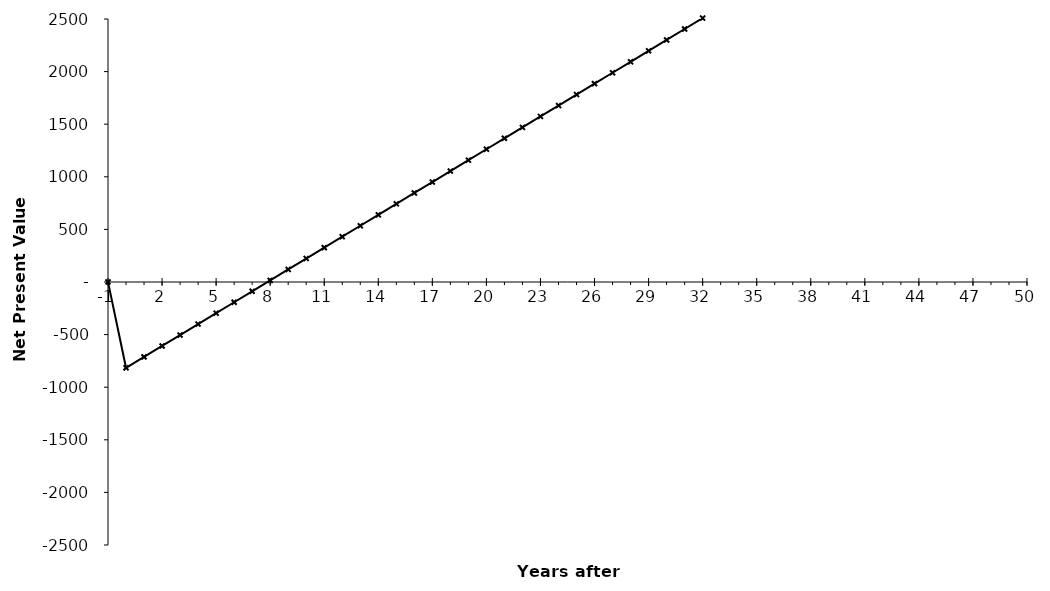
| Category | Net Present Value |
|---|---|
| -1.0 | 0 |
| 0.0 | -815821465.334 |
| 1.0 | -711931258.689 |
| 2.0 | -608041052.045 |
| 3.0 | -504150845.401 |
| 4.0 | -400260638.757 |
| 5.0 | -296370432.113 |
| 6.0 | -192480225.469 |
| 7.0 | -88590018.824 |
| 8.0 | 15300187.82 |
| 9.0 | 119190394.464 |
| 10.0 | 223080601.108 |
| 11.0 | 326970807.752 |
| 12.0 | 430861014.396 |
| 13.0 | 534751221.04 |
| 14.0 | 638641427.685 |
| 15.0 | 742531634.329 |
| 16.0 | 846421840.973 |
| 17.0 | 950312047.617 |
| 18.0 | 1054202254.261 |
| 19.0 | 1158092460.905 |
| 20.0 | 1261982667.55 |
| 21.0 | 1365872874.194 |
| 22.0 | 1469763080.838 |
| 23.0 | 1573653287.482 |
| 24.0 | 1677543494.126 |
| 25.0 | 1781433700.77 |
| 26.0 | 1885323907.415 |
| 27.0 | 1989214114.059 |
| 28.0 | 2093104320.703 |
| 29.0 | 2196994527.347 |
| 30.0 | 2300884733.991 |
| 31.0 | 2404774940.635 |
| 32.0 | 2508665147.279 |
| 33.0 | 2612555353.924 |
| 34.0 | 2716445560.568 |
| 35.0 | 2820335767.212 |
| 36.0 | 2924225973.856 |
| 37.0 | 3028116180.5 |
| 38.0 | 3132006387.144 |
| 39.0 | 3235896593.789 |
| 40.0 | 3339786800.433 |
| 41.0 | 3443677007.077 |
| 42.0 | 3547567213.721 |
| 43.0 | 3651457420.365 |
| 44.0 | 3755347627.009 |
| 45.0 | 3859237833.654 |
| 46.0 | 3963128040.298 |
| 47.0 | 4067018246.942 |
| 48.0 | 4170908453.586 |
| 49.0 | 4274798660.23 |
| 50.0 | 4395440612.823 |